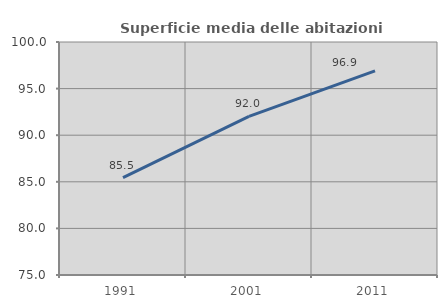
| Category | Superficie media delle abitazioni occupate |
|---|---|
| 1991.0 | 85.453 |
| 2001.0 | 92.023 |
| 2011.0 | 96.897 |